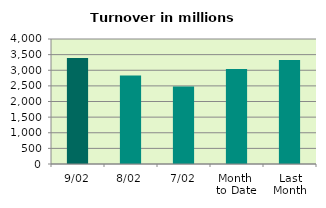
| Category | Series 0 |
|---|---|
| 9/02 | 3392.903 |
| 8/02 | 2834.391 |
| 7/02 | 2483.001 |
| Month 
to Date | 3039.624 |
| Last
Month | 3330.335 |